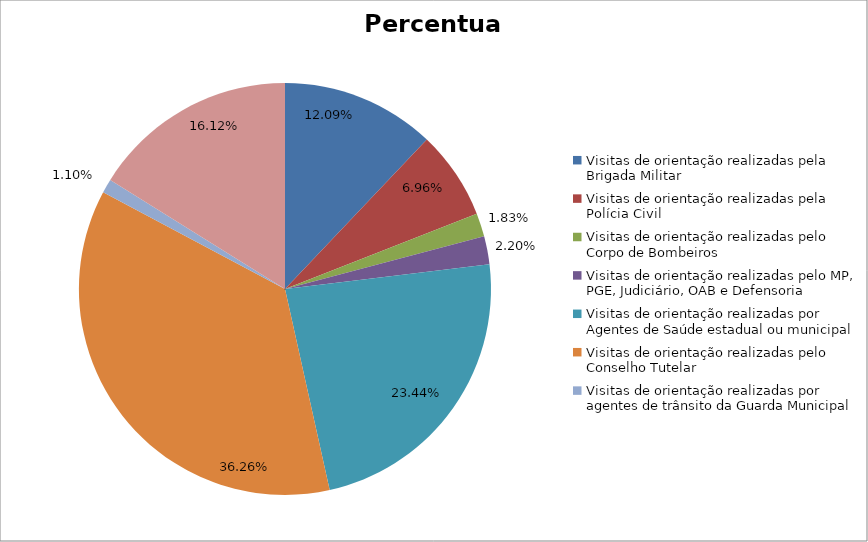
| Category | Percentual |
|---|---|
| Visitas de orientação realizadas pela Brigada Militar | 0.121 |
| Visitas de orientação realizadas pela Polícia Civil | 0.07 |
| Visitas de orientação realizadas pelo Corpo de Bombeiros | 0.018 |
| Visitas de orientação realizadas pelo MP, PGE, Judiciário, OAB e Defensoria | 0.022 |
| Visitas de orientação realizadas por Agentes de Saúde estadual ou municipal | 0.234 |
| Visitas de orientação realizadas pelo Conselho Tutelar | 0.363 |
| Visitas de orientação realizadas por agentes de trânsito da Guarda Municipal | 0.011 |
| Visitas de orientação realizadas por ONGs, entidades privadas, CRAS e CREAS | 0.161 |